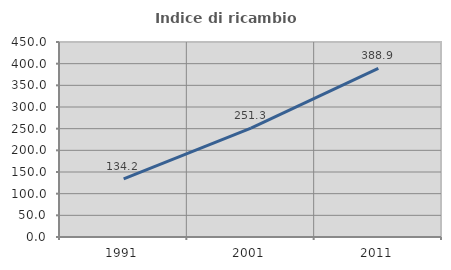
| Category | Indice di ricambio occupazionale  |
|---|---|
| 1991.0 | 134.247 |
| 2001.0 | 251.282 |
| 2011.0 | 388.889 |